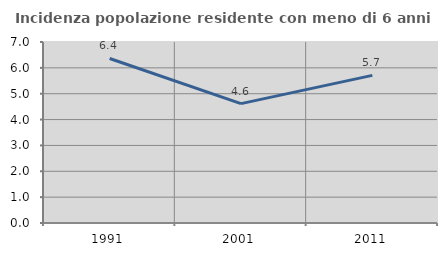
| Category | Incidenza popolazione residente con meno di 6 anni |
|---|---|
| 1991.0 | 6.363 |
| 2001.0 | 4.616 |
| 2011.0 | 5.708 |